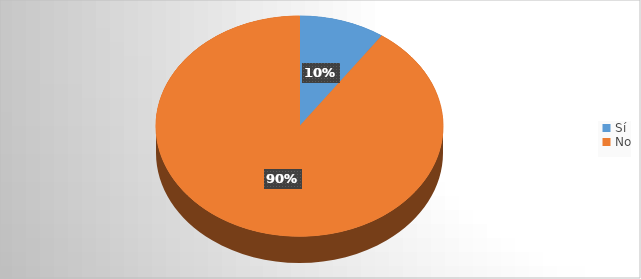
| Category | Series 0 |
|---|---|
| Sí | 9 |
| No | 84 |